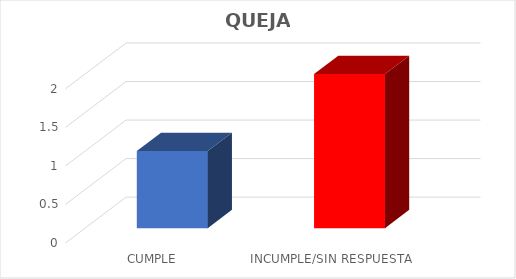
| Category | TOTAL |
|---|---|
| CUMPLE | 1 |
| INCUMPLE/SIN RESPUESTA | 2 |